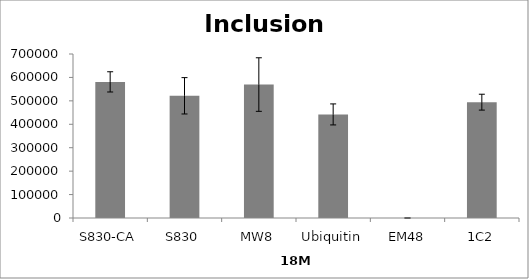
| Category | Series 0 |
|---|---|
| S830-CA | 581021.099 |
| S830 | 521608.993 |
| MW8 | 569580.04 |
| Ubiquitin | 442095.389 |
| EM48 | 0 |
| 1C2 | 494420.262 |